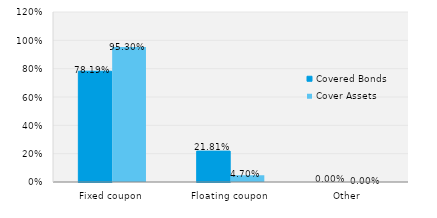
| Category | Covered Bonds | Cover Assets |
|---|---|---|
| Fixed coupon | 0.782 | 0.953 |
| Floating coupon | 0.218 | 0.047 |
| Other | 0 | 0 |